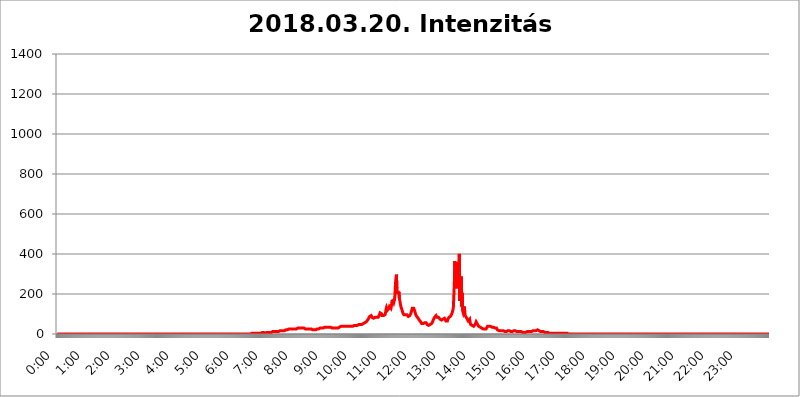
| Category | 2018.03.20. Intenzitás [W/m^2] |
|---|---|
| 0.0 | 0 |
| 0.0006944444444444445 | 0 |
| 0.001388888888888889 | 0 |
| 0.0020833333333333333 | 0 |
| 0.002777777777777778 | 0 |
| 0.003472222222222222 | 0 |
| 0.004166666666666667 | 0 |
| 0.004861111111111111 | 0 |
| 0.005555555555555556 | 0 |
| 0.0062499999999999995 | 0 |
| 0.006944444444444444 | 0 |
| 0.007638888888888889 | 0 |
| 0.008333333333333333 | 0 |
| 0.009027777777777779 | 0 |
| 0.009722222222222222 | 0 |
| 0.010416666666666666 | 0 |
| 0.011111111111111112 | 0 |
| 0.011805555555555555 | 0 |
| 0.012499999999999999 | 0 |
| 0.013194444444444444 | 0 |
| 0.013888888888888888 | 0 |
| 0.014583333333333332 | 0 |
| 0.015277777777777777 | 0 |
| 0.015972222222222224 | 0 |
| 0.016666666666666666 | 0 |
| 0.017361111111111112 | 0 |
| 0.018055555555555557 | 0 |
| 0.01875 | 0 |
| 0.019444444444444445 | 0 |
| 0.02013888888888889 | 0 |
| 0.020833333333333332 | 0 |
| 0.02152777777777778 | 0 |
| 0.022222222222222223 | 0 |
| 0.02291666666666667 | 0 |
| 0.02361111111111111 | 0 |
| 0.024305555555555556 | 0 |
| 0.024999999999999998 | 0 |
| 0.025694444444444447 | 0 |
| 0.02638888888888889 | 0 |
| 0.027083333333333334 | 0 |
| 0.027777777777777776 | 0 |
| 0.02847222222222222 | 0 |
| 0.029166666666666664 | 0 |
| 0.029861111111111113 | 0 |
| 0.030555555555555555 | 0 |
| 0.03125 | 0 |
| 0.03194444444444445 | 0 |
| 0.03263888888888889 | 0 |
| 0.03333333333333333 | 0 |
| 0.034027777777777775 | 0 |
| 0.034722222222222224 | 0 |
| 0.035416666666666666 | 0 |
| 0.036111111111111115 | 0 |
| 0.03680555555555556 | 0 |
| 0.0375 | 0 |
| 0.03819444444444444 | 0 |
| 0.03888888888888889 | 0 |
| 0.03958333333333333 | 0 |
| 0.04027777777777778 | 0 |
| 0.04097222222222222 | 0 |
| 0.041666666666666664 | 0 |
| 0.042361111111111106 | 0 |
| 0.04305555555555556 | 0 |
| 0.043750000000000004 | 0 |
| 0.044444444444444446 | 0 |
| 0.04513888888888889 | 0 |
| 0.04583333333333334 | 0 |
| 0.04652777777777778 | 0 |
| 0.04722222222222222 | 0 |
| 0.04791666666666666 | 0 |
| 0.04861111111111111 | 0 |
| 0.049305555555555554 | 0 |
| 0.049999999999999996 | 0 |
| 0.05069444444444445 | 0 |
| 0.051388888888888894 | 0 |
| 0.052083333333333336 | 0 |
| 0.05277777777777778 | 0 |
| 0.05347222222222222 | 0 |
| 0.05416666666666667 | 0 |
| 0.05486111111111111 | 0 |
| 0.05555555555555555 | 0 |
| 0.05625 | 0 |
| 0.05694444444444444 | 0 |
| 0.057638888888888885 | 0 |
| 0.05833333333333333 | 0 |
| 0.05902777777777778 | 0 |
| 0.059722222222222225 | 0 |
| 0.06041666666666667 | 0 |
| 0.061111111111111116 | 0 |
| 0.06180555555555556 | 0 |
| 0.0625 | 0 |
| 0.06319444444444444 | 0 |
| 0.06388888888888888 | 0 |
| 0.06458333333333334 | 0 |
| 0.06527777777777778 | 0 |
| 0.06597222222222222 | 0 |
| 0.06666666666666667 | 0 |
| 0.06736111111111111 | 0 |
| 0.06805555555555555 | 0 |
| 0.06874999999999999 | 0 |
| 0.06944444444444443 | 0 |
| 0.07013888888888889 | 0 |
| 0.07083333333333333 | 0 |
| 0.07152777777777779 | 0 |
| 0.07222222222222223 | 0 |
| 0.07291666666666667 | 0 |
| 0.07361111111111111 | 0 |
| 0.07430555555555556 | 0 |
| 0.075 | 0 |
| 0.07569444444444444 | 0 |
| 0.0763888888888889 | 0 |
| 0.07708333333333334 | 0 |
| 0.07777777777777778 | 0 |
| 0.07847222222222222 | 0 |
| 0.07916666666666666 | 0 |
| 0.0798611111111111 | 0 |
| 0.08055555555555556 | 0 |
| 0.08125 | 0 |
| 0.08194444444444444 | 0 |
| 0.08263888888888889 | 0 |
| 0.08333333333333333 | 0 |
| 0.08402777777777777 | 0 |
| 0.08472222222222221 | 0 |
| 0.08541666666666665 | 0 |
| 0.08611111111111112 | 0 |
| 0.08680555555555557 | 0 |
| 0.08750000000000001 | 0 |
| 0.08819444444444445 | 0 |
| 0.08888888888888889 | 0 |
| 0.08958333333333333 | 0 |
| 0.09027777777777778 | 0 |
| 0.09097222222222222 | 0 |
| 0.09166666666666667 | 0 |
| 0.09236111111111112 | 0 |
| 0.09305555555555556 | 0 |
| 0.09375 | 0 |
| 0.09444444444444444 | 0 |
| 0.09513888888888888 | 0 |
| 0.09583333333333333 | 0 |
| 0.09652777777777777 | 0 |
| 0.09722222222222222 | 0 |
| 0.09791666666666667 | 0 |
| 0.09861111111111111 | 0 |
| 0.09930555555555555 | 0 |
| 0.09999999999999999 | 0 |
| 0.10069444444444443 | 0 |
| 0.1013888888888889 | 0 |
| 0.10208333333333335 | 0 |
| 0.10277777777777779 | 0 |
| 0.10347222222222223 | 0 |
| 0.10416666666666667 | 0 |
| 0.10486111111111111 | 0 |
| 0.10555555555555556 | 0 |
| 0.10625 | 0 |
| 0.10694444444444444 | 0 |
| 0.1076388888888889 | 0 |
| 0.10833333333333334 | 0 |
| 0.10902777777777778 | 0 |
| 0.10972222222222222 | 0 |
| 0.1111111111111111 | 0 |
| 0.11180555555555556 | 0 |
| 0.11180555555555556 | 0 |
| 0.1125 | 0 |
| 0.11319444444444444 | 0 |
| 0.11388888888888889 | 0 |
| 0.11458333333333333 | 0 |
| 0.11527777777777777 | 0 |
| 0.11597222222222221 | 0 |
| 0.11666666666666665 | 0 |
| 0.1173611111111111 | 0 |
| 0.11805555555555557 | 0 |
| 0.11944444444444445 | 0 |
| 0.12013888888888889 | 0 |
| 0.12083333333333333 | 0 |
| 0.12152777777777778 | 0 |
| 0.12222222222222223 | 0 |
| 0.12291666666666667 | 0 |
| 0.12291666666666667 | 0 |
| 0.12361111111111112 | 0 |
| 0.12430555555555556 | 0 |
| 0.125 | 0 |
| 0.12569444444444444 | 0 |
| 0.12638888888888888 | 0 |
| 0.12708333333333333 | 0 |
| 0.16875 | 0 |
| 0.12847222222222224 | 0 |
| 0.12916666666666668 | 0 |
| 0.12986111111111112 | 0 |
| 0.13055555555555556 | 0 |
| 0.13125 | 0 |
| 0.13194444444444445 | 0 |
| 0.1326388888888889 | 0 |
| 0.13333333333333333 | 0 |
| 0.13402777777777777 | 0 |
| 0.13402777777777777 | 0 |
| 0.13472222222222222 | 0 |
| 0.13541666666666666 | 0 |
| 0.1361111111111111 | 0 |
| 0.13749999999999998 | 0 |
| 0.13819444444444443 | 0 |
| 0.1388888888888889 | 0 |
| 0.13958333333333334 | 0 |
| 0.14027777777777778 | 0 |
| 0.14097222222222222 | 0 |
| 0.14166666666666666 | 0 |
| 0.1423611111111111 | 0 |
| 0.14305555555555557 | 0 |
| 0.14375000000000002 | 0 |
| 0.14444444444444446 | 0 |
| 0.1451388888888889 | 0 |
| 0.1451388888888889 | 0 |
| 0.14652777777777778 | 0 |
| 0.14722222222222223 | 0 |
| 0.14791666666666667 | 0 |
| 0.1486111111111111 | 0 |
| 0.14930555555555555 | 0 |
| 0.15 | 0 |
| 0.15069444444444444 | 0 |
| 0.15138888888888888 | 0 |
| 0.15208333333333332 | 0 |
| 0.15277777777777776 | 0 |
| 0.15347222222222223 | 0 |
| 0.15416666666666667 | 0 |
| 0.15486111111111112 | 0 |
| 0.15555555555555556 | 0 |
| 0.15625 | 0 |
| 0.15694444444444444 | 0 |
| 0.15763888888888888 | 0 |
| 0.15833333333333333 | 0 |
| 0.15902777777777777 | 0 |
| 0.15972222222222224 | 0 |
| 0.16041666666666668 | 0 |
| 0.16111111111111112 | 0 |
| 0.16180555555555556 | 0 |
| 0.1625 | 0 |
| 0.16319444444444445 | 0 |
| 0.1638888888888889 | 0 |
| 0.16458333333333333 | 0 |
| 0.16527777777777777 | 0 |
| 0.16597222222222222 | 0 |
| 0.16666666666666666 | 0 |
| 0.1673611111111111 | 0 |
| 0.16805555555555554 | 0 |
| 0.16874999999999998 | 0 |
| 0.16944444444444443 | 0 |
| 0.17013888888888887 | 0 |
| 0.1708333333333333 | 0 |
| 0.17152777777777775 | 0 |
| 0.17222222222222225 | 0 |
| 0.1729166666666667 | 0 |
| 0.17361111111111113 | 0 |
| 0.17430555555555557 | 0 |
| 0.17500000000000002 | 0 |
| 0.17569444444444446 | 0 |
| 0.1763888888888889 | 0 |
| 0.17708333333333334 | 0 |
| 0.17777777777777778 | 0 |
| 0.17847222222222223 | 0 |
| 0.17916666666666667 | 0 |
| 0.1798611111111111 | 0 |
| 0.18055555555555555 | 0 |
| 0.18125 | 0 |
| 0.18194444444444444 | 0 |
| 0.1826388888888889 | 0 |
| 0.18333333333333335 | 0 |
| 0.1840277777777778 | 0 |
| 0.18472222222222223 | 0 |
| 0.18541666666666667 | 0 |
| 0.18611111111111112 | 0 |
| 0.18680555555555556 | 0 |
| 0.1875 | 0 |
| 0.18819444444444444 | 0 |
| 0.18888888888888888 | 0 |
| 0.18958333333333333 | 0 |
| 0.19027777777777777 | 0 |
| 0.1909722222222222 | 0 |
| 0.19166666666666665 | 0 |
| 0.19236111111111112 | 0 |
| 0.19305555555555554 | 0 |
| 0.19375 | 0 |
| 0.19444444444444445 | 0 |
| 0.1951388888888889 | 0 |
| 0.19583333333333333 | 0 |
| 0.19652777777777777 | 0 |
| 0.19722222222222222 | 0 |
| 0.19791666666666666 | 0 |
| 0.1986111111111111 | 0 |
| 0.19930555555555554 | 0 |
| 0.19999999999999998 | 0 |
| 0.20069444444444443 | 0 |
| 0.20138888888888887 | 0 |
| 0.2020833333333333 | 0 |
| 0.2027777777777778 | 0 |
| 0.2034722222222222 | 0 |
| 0.2041666666666667 | 0 |
| 0.20486111111111113 | 0 |
| 0.20555555555555557 | 0 |
| 0.20625000000000002 | 0 |
| 0.20694444444444446 | 0 |
| 0.2076388888888889 | 0 |
| 0.20833333333333334 | 0 |
| 0.20902777777777778 | 0 |
| 0.20972222222222223 | 0 |
| 0.21041666666666667 | 0 |
| 0.2111111111111111 | 0 |
| 0.21180555555555555 | 0 |
| 0.2125 | 0 |
| 0.21319444444444444 | 0 |
| 0.2138888888888889 | 0 |
| 0.21458333333333335 | 0 |
| 0.2152777777777778 | 0 |
| 0.21597222222222223 | 0 |
| 0.21666666666666667 | 0 |
| 0.21736111111111112 | 0 |
| 0.21805555555555556 | 0 |
| 0.21875 | 0 |
| 0.21944444444444444 | 0 |
| 0.22013888888888888 | 0 |
| 0.22083333333333333 | 0 |
| 0.22152777777777777 | 0 |
| 0.2222222222222222 | 0 |
| 0.22291666666666665 | 0 |
| 0.2236111111111111 | 0 |
| 0.22430555555555556 | 0 |
| 0.225 | 0 |
| 0.22569444444444445 | 0 |
| 0.2263888888888889 | 0 |
| 0.22708333333333333 | 0 |
| 0.22777777777777777 | 0 |
| 0.22847222222222222 | 0 |
| 0.22916666666666666 | 0 |
| 0.2298611111111111 | 0 |
| 0.23055555555555554 | 0 |
| 0.23124999999999998 | 0 |
| 0.23194444444444443 | 0 |
| 0.23263888888888887 | 0 |
| 0.2333333333333333 | 0 |
| 0.2340277777777778 | 0 |
| 0.2347222222222222 | 0 |
| 0.2354166666666667 | 0 |
| 0.23611111111111113 | 0 |
| 0.23680555555555557 | 0 |
| 0.23750000000000002 | 0 |
| 0.23819444444444446 | 0 |
| 0.2388888888888889 | 0 |
| 0.23958333333333334 | 0 |
| 0.24027777777777778 | 0 |
| 0.24097222222222223 | 0 |
| 0.24166666666666667 | 0 |
| 0.2423611111111111 | 0 |
| 0.24305555555555555 | 0 |
| 0.24375 | 0 |
| 0.24444444444444446 | 0 |
| 0.24513888888888888 | 0 |
| 0.24583333333333335 | 0 |
| 0.2465277777777778 | 0 |
| 0.24722222222222223 | 0 |
| 0.24791666666666667 | 0 |
| 0.24861111111111112 | 0 |
| 0.24930555555555556 | 0 |
| 0.25 | 0 |
| 0.25069444444444444 | 0 |
| 0.2513888888888889 | 0 |
| 0.2520833333333333 | 0 |
| 0.25277777777777777 | 0 |
| 0.2534722222222222 | 0 |
| 0.25416666666666665 | 0 |
| 0.2548611111111111 | 0 |
| 0.2555555555555556 | 0 |
| 0.25625000000000003 | 0 |
| 0.2569444444444445 | 0 |
| 0.2576388888888889 | 0 |
| 0.25833333333333336 | 0 |
| 0.2590277777777778 | 0 |
| 0.25972222222222224 | 0 |
| 0.2604166666666667 | 0 |
| 0.2611111111111111 | 0 |
| 0.26180555555555557 | 0 |
| 0.2625 | 0 |
| 0.26319444444444445 | 0 |
| 0.2638888888888889 | 0 |
| 0.26458333333333334 | 0 |
| 0.2652777777777778 | 0 |
| 0.2659722222222222 | 0 |
| 0.26666666666666666 | 0 |
| 0.2673611111111111 | 0 |
| 0.26805555555555555 | 0 |
| 0.26875 | 0 |
| 0.26944444444444443 | 3.525 |
| 0.2701388888888889 | 0 |
| 0.2708333333333333 | 0 |
| 0.27152777777777776 | 3.525 |
| 0.2722222222222222 | 3.525 |
| 0.27291666666666664 | 3.525 |
| 0.2736111111111111 | 3.525 |
| 0.2743055555555555 | 3.525 |
| 0.27499999999999997 | 3.525 |
| 0.27569444444444446 | 3.525 |
| 0.27638888888888885 | 3.525 |
| 0.27708333333333335 | 3.525 |
| 0.2777777777777778 | 3.525 |
| 0.27847222222222223 | 3.525 |
| 0.2791666666666667 | 3.525 |
| 0.2798611111111111 | 3.525 |
| 0.28055555555555556 | 3.525 |
| 0.28125 | 3.525 |
| 0.28194444444444444 | 3.525 |
| 0.2826388888888889 | 3.525 |
| 0.2833333333333333 | 3.525 |
| 0.28402777777777777 | 3.525 |
| 0.2847222222222222 | 3.525 |
| 0.28541666666666665 | 3.525 |
| 0.28611111111111115 | 7.887 |
| 0.28680555555555554 | 7.887 |
| 0.28750000000000003 | 7.887 |
| 0.2881944444444445 | 7.887 |
| 0.2888888888888889 | 7.887 |
| 0.28958333333333336 | 7.887 |
| 0.2902777777777778 | 7.887 |
| 0.29097222222222224 | 3.525 |
| 0.2916666666666667 | 3.525 |
| 0.2923611111111111 | 3.525 |
| 0.29305555555555557 | 7.887 |
| 0.29375 | 7.887 |
| 0.29444444444444445 | 7.887 |
| 0.2951388888888889 | 7.887 |
| 0.29583333333333334 | 7.887 |
| 0.2965277777777778 | 7.887 |
| 0.2972222222222222 | 7.887 |
| 0.29791666666666666 | 7.887 |
| 0.2986111111111111 | 7.887 |
| 0.29930555555555555 | 12.257 |
| 0.3 | 7.887 |
| 0.30069444444444443 | 12.257 |
| 0.3013888888888889 | 12.257 |
| 0.3020833333333333 | 12.257 |
| 0.30277777777777776 | 12.257 |
| 0.3034722222222222 | 12.257 |
| 0.30416666666666664 | 12.257 |
| 0.3048611111111111 | 12.257 |
| 0.3055555555555555 | 12.257 |
| 0.30624999999999997 | 12.257 |
| 0.3069444444444444 | 12.257 |
| 0.3076388888888889 | 12.257 |
| 0.30833333333333335 | 12.257 |
| 0.3090277777777778 | 12.257 |
| 0.30972222222222223 | 12.257 |
| 0.3104166666666667 | 12.257 |
| 0.3111111111111111 | 12.257 |
| 0.31180555555555556 | 16.636 |
| 0.3125 | 16.636 |
| 0.31319444444444444 | 16.636 |
| 0.3138888888888889 | 16.636 |
| 0.3145833333333333 | 16.636 |
| 0.31527777777777777 | 16.636 |
| 0.3159722222222222 | 16.636 |
| 0.31666666666666665 | 16.636 |
| 0.31736111111111115 | 16.636 |
| 0.31805555555555554 | 16.636 |
| 0.31875000000000003 | 16.636 |
| 0.3194444444444445 | 21.024 |
| 0.3201388888888889 | 21.024 |
| 0.32083333333333336 | 21.024 |
| 0.3215277777777778 | 21.024 |
| 0.32222222222222224 | 21.024 |
| 0.3229166666666667 | 21.024 |
| 0.3236111111111111 | 21.024 |
| 0.32430555555555557 | 21.024 |
| 0.325 | 25.419 |
| 0.32569444444444445 | 25.419 |
| 0.3263888888888889 | 25.419 |
| 0.32708333333333334 | 25.419 |
| 0.3277777777777778 | 25.419 |
| 0.3284722222222222 | 25.419 |
| 0.32916666666666666 | 25.419 |
| 0.3298611111111111 | 25.419 |
| 0.33055555555555555 | 25.419 |
| 0.33125 | 25.419 |
| 0.33194444444444443 | 25.419 |
| 0.3326388888888889 | 25.419 |
| 0.3333333333333333 | 25.419 |
| 0.3340277777777778 | 25.419 |
| 0.3347222222222222 | 25.419 |
| 0.3354166666666667 | 25.419 |
| 0.3361111111111111 | 29.823 |
| 0.3368055555555556 | 29.823 |
| 0.33749999999999997 | 29.823 |
| 0.33819444444444446 | 29.823 |
| 0.33888888888888885 | 29.823 |
| 0.33958333333333335 | 29.823 |
| 0.34027777777777773 | 29.823 |
| 0.34097222222222223 | 29.823 |
| 0.3416666666666666 | 29.823 |
| 0.3423611111111111 | 29.823 |
| 0.3430555555555555 | 29.823 |
| 0.34375 | 29.823 |
| 0.3444444444444445 | 29.823 |
| 0.3451388888888889 | 29.823 |
| 0.3458333333333334 | 29.823 |
| 0.34652777777777777 | 29.823 |
| 0.34722222222222227 | 25.419 |
| 0.34791666666666665 | 25.419 |
| 0.34861111111111115 | 25.419 |
| 0.34930555555555554 | 25.419 |
| 0.35000000000000003 | 25.419 |
| 0.3506944444444444 | 25.419 |
| 0.3513888888888889 | 25.419 |
| 0.3520833333333333 | 25.419 |
| 0.3527777777777778 | 25.419 |
| 0.3534722222222222 | 25.419 |
| 0.3541666666666667 | 25.419 |
| 0.3548611111111111 | 25.419 |
| 0.35555555555555557 | 25.419 |
| 0.35625 | 25.419 |
| 0.35694444444444445 | 25.419 |
| 0.3576388888888889 | 25.419 |
| 0.35833333333333334 | 21.024 |
| 0.3590277777777778 | 21.024 |
| 0.3597222222222222 | 21.024 |
| 0.36041666666666666 | 21.024 |
| 0.3611111111111111 | 21.024 |
| 0.36180555555555555 | 21.024 |
| 0.3625 | 21.024 |
| 0.36319444444444443 | 25.419 |
| 0.3638888888888889 | 25.419 |
| 0.3645833333333333 | 25.419 |
| 0.3652777777777778 | 25.419 |
| 0.3659722222222222 | 25.419 |
| 0.3666666666666667 | 25.419 |
| 0.3673611111111111 | 29.823 |
| 0.3680555555555556 | 25.419 |
| 0.36874999999999997 | 29.823 |
| 0.36944444444444446 | 29.823 |
| 0.37013888888888885 | 29.823 |
| 0.37083333333333335 | 29.823 |
| 0.37152777777777773 | 29.823 |
| 0.37222222222222223 | 29.823 |
| 0.3729166666666666 | 29.823 |
| 0.3736111111111111 | 34.234 |
| 0.3743055555555555 | 34.234 |
| 0.375 | 34.234 |
| 0.3756944444444445 | 34.234 |
| 0.3763888888888889 | 34.234 |
| 0.3770833333333334 | 34.234 |
| 0.37777777777777777 | 34.234 |
| 0.37847222222222227 | 34.234 |
| 0.37916666666666665 | 34.234 |
| 0.37986111111111115 | 34.234 |
| 0.38055555555555554 | 34.234 |
| 0.38125000000000003 | 34.234 |
| 0.3819444444444444 | 34.234 |
| 0.3826388888888889 | 34.234 |
| 0.3833333333333333 | 34.234 |
| 0.3840277777777778 | 29.823 |
| 0.3847222222222222 | 29.823 |
| 0.3854166666666667 | 29.823 |
| 0.3861111111111111 | 29.823 |
| 0.38680555555555557 | 29.823 |
| 0.3875 | 29.823 |
| 0.38819444444444445 | 29.823 |
| 0.3888888888888889 | 29.823 |
| 0.38958333333333334 | 29.823 |
| 0.3902777777777778 | 29.823 |
| 0.3909722222222222 | 29.823 |
| 0.39166666666666666 | 29.823 |
| 0.3923611111111111 | 29.823 |
| 0.39305555555555555 | 29.823 |
| 0.39375 | 29.823 |
| 0.39444444444444443 | 34.234 |
| 0.3951388888888889 | 34.234 |
| 0.3958333333333333 | 34.234 |
| 0.3965277777777778 | 34.234 |
| 0.3972222222222222 | 34.234 |
| 0.3979166666666667 | 38.653 |
| 0.3986111111111111 | 38.653 |
| 0.3993055555555556 | 38.653 |
| 0.39999999999999997 | 38.653 |
| 0.40069444444444446 | 38.653 |
| 0.40138888888888885 | 38.653 |
| 0.40208333333333335 | 38.653 |
| 0.40277777777777773 | 38.653 |
| 0.40347222222222223 | 38.653 |
| 0.4041666666666666 | 38.653 |
| 0.4048611111111111 | 38.653 |
| 0.4055555555555555 | 38.653 |
| 0.40625 | 38.653 |
| 0.4069444444444445 | 38.653 |
| 0.4076388888888889 | 38.653 |
| 0.4083333333333334 | 38.653 |
| 0.40902777777777777 | 38.653 |
| 0.40972222222222227 | 38.653 |
| 0.41041666666666665 | 38.653 |
| 0.41111111111111115 | 38.653 |
| 0.41180555555555554 | 38.653 |
| 0.41250000000000003 | 38.653 |
| 0.4131944444444444 | 38.653 |
| 0.4138888888888889 | 38.653 |
| 0.4145833333333333 | 38.653 |
| 0.4152777777777778 | 38.653 |
| 0.4159722222222222 | 38.653 |
| 0.4166666666666667 | 43.079 |
| 0.4173611111111111 | 38.653 |
| 0.41805555555555557 | 43.079 |
| 0.41875 | 43.079 |
| 0.41944444444444445 | 43.079 |
| 0.4201388888888889 | 43.079 |
| 0.42083333333333334 | 43.079 |
| 0.4215277777777778 | 43.079 |
| 0.4222222222222222 | 43.079 |
| 0.42291666666666666 | 47.511 |
| 0.4236111111111111 | 47.511 |
| 0.42430555555555555 | 47.511 |
| 0.425 | 47.511 |
| 0.42569444444444443 | 47.511 |
| 0.4263888888888889 | 47.511 |
| 0.4270833333333333 | 47.511 |
| 0.4277777777777778 | 51.951 |
| 0.4284722222222222 | 51.951 |
| 0.4291666666666667 | 51.951 |
| 0.4298611111111111 | 56.398 |
| 0.4305555555555556 | 56.398 |
| 0.43124999999999997 | 56.398 |
| 0.43194444444444446 | 60.85 |
| 0.43263888888888885 | 60.85 |
| 0.43333333333333335 | 60.85 |
| 0.43402777777777773 | 65.31 |
| 0.43472222222222223 | 65.31 |
| 0.4354166666666666 | 69.775 |
| 0.4361111111111111 | 74.246 |
| 0.4368055555555555 | 78.722 |
| 0.4375 | 83.205 |
| 0.4381944444444445 | 87.692 |
| 0.4388888888888889 | 87.692 |
| 0.4395833333333334 | 92.184 |
| 0.44027777777777777 | 92.184 |
| 0.44097222222222227 | 92.184 |
| 0.44166666666666665 | 83.205 |
| 0.44236111111111115 | 83.205 |
| 0.44305555555555554 | 78.722 |
| 0.44375000000000003 | 78.722 |
| 0.4444444444444444 | 78.722 |
| 0.4451388888888889 | 83.205 |
| 0.4458333333333333 | 83.205 |
| 0.4465277777777778 | 87.692 |
| 0.4472222222222222 | 83.205 |
| 0.4479166666666667 | 83.205 |
| 0.4486111111111111 | 83.205 |
| 0.44930555555555557 | 83.205 |
| 0.45 | 83.205 |
| 0.45069444444444445 | 87.692 |
| 0.4513888888888889 | 92.184 |
| 0.45208333333333334 | 96.682 |
| 0.4527777777777778 | 105.69 |
| 0.4534722222222222 | 110.201 |
| 0.45416666666666666 | 110.201 |
| 0.4548611111111111 | 101.184 |
| 0.45555555555555555 | 92.184 |
| 0.45625 | 92.184 |
| 0.45694444444444443 | 96.682 |
| 0.4576388888888889 | 92.184 |
| 0.4583333333333333 | 87.692 |
| 0.4590277777777778 | 92.184 |
| 0.4597222222222222 | 96.682 |
| 0.4604166666666667 | 105.69 |
| 0.4611111111111111 | 123.758 |
| 0.4618055555555556 | 132.814 |
| 0.46249999999999997 | 132.814 |
| 0.46319444444444446 | 119.235 |
| 0.46388888888888885 | 114.716 |
| 0.46458333333333335 | 119.235 |
| 0.46527777777777773 | 128.284 |
| 0.46597222222222223 | 137.347 |
| 0.4666666666666666 | 132.814 |
| 0.4673611111111111 | 132.814 |
| 0.4680555555555555 | 128.284 |
| 0.46875 | 141.884 |
| 0.4694444444444445 | 164.605 |
| 0.4701388888888889 | 160.056 |
| 0.4708333333333334 | 160.056 |
| 0.47152777777777777 | 169.156 |
| 0.47222222222222227 | 160.056 |
| 0.47291666666666665 | 169.156 |
| 0.47361111111111115 | 191.937 |
| 0.47430555555555554 | 246.689 |
| 0.47500000000000003 | 278.603 |
| 0.4756944444444444 | 296.808 |
| 0.4763888888888889 | 228.436 |
| 0.4770833333333333 | 201.058 |
| 0.4777777777777778 | 214.746 |
| 0.4784722222222222 | 201.058 |
| 0.4791666666666667 | 210.182 |
| 0.4798611111111111 | 178.264 |
| 0.48055555555555557 | 164.605 |
| 0.48125 | 164.605 |
| 0.48194444444444445 | 137.347 |
| 0.4826388888888889 | 132.814 |
| 0.48333333333333334 | 137.347 |
| 0.4840277777777778 | 114.716 |
| 0.4847222222222222 | 105.69 |
| 0.48541666666666666 | 101.184 |
| 0.4861111111111111 | 96.682 |
| 0.48680555555555555 | 96.682 |
| 0.4875 | 92.184 |
| 0.48819444444444443 | 96.682 |
| 0.4888888888888889 | 101.184 |
| 0.4895833333333333 | 101.184 |
| 0.4902777777777778 | 96.682 |
| 0.4909722222222222 | 92.184 |
| 0.4916666666666667 | 92.184 |
| 0.4923611111111111 | 87.692 |
| 0.4930555555555556 | 87.692 |
| 0.49374999999999997 | 87.692 |
| 0.49444444444444446 | 92.184 |
| 0.49513888888888885 | 96.682 |
| 0.49583333333333335 | 101.184 |
| 0.49652777777777773 | 110.201 |
| 0.49722222222222223 | 119.235 |
| 0.4979166666666666 | 128.284 |
| 0.4986111111111111 | 132.814 |
| 0.4993055555555555 | 132.814 |
| 0.5 | 128.284 |
| 0.5006944444444444 | 123.758 |
| 0.5013888888888889 | 114.716 |
| 0.5020833333333333 | 105.69 |
| 0.5027777777777778 | 96.682 |
| 0.5034722222222222 | 92.184 |
| 0.5041666666666667 | 87.692 |
| 0.5048611111111111 | 83.205 |
| 0.5055555555555555 | 83.205 |
| 0.50625 | 78.722 |
| 0.5069444444444444 | 74.246 |
| 0.5076388888888889 | 69.775 |
| 0.5083333333333333 | 69.775 |
| 0.5090277777777777 | 65.31 |
| 0.5097222222222222 | 60.85 |
| 0.5104166666666666 | 56.398 |
| 0.5111111111111112 | 51.951 |
| 0.5118055555555555 | 51.951 |
| 0.5125000000000001 | 51.951 |
| 0.5131944444444444 | 51.951 |
| 0.513888888888889 | 51.951 |
| 0.5145833333333333 | 51.951 |
| 0.5152777777777778 | 56.398 |
| 0.5159722222222222 | 56.398 |
| 0.5166666666666667 | 56.398 |
| 0.517361111111111 | 56.398 |
| 0.5180555555555556 | 51.951 |
| 0.5187499999999999 | 47.511 |
| 0.5194444444444445 | 47.511 |
| 0.5201388888888888 | 43.079 |
| 0.5208333333333334 | 43.079 |
| 0.5215277777777778 | 47.511 |
| 0.5222222222222223 | 47.511 |
| 0.5229166666666667 | 47.511 |
| 0.5236111111111111 | 47.511 |
| 0.5243055555555556 | 47.511 |
| 0.525 | 51.951 |
| 0.5256944444444445 | 56.398 |
| 0.5263888888888889 | 60.85 |
| 0.5270833333333333 | 65.31 |
| 0.5277777777777778 | 74.246 |
| 0.5284722222222222 | 78.722 |
| 0.5291666666666667 | 83.205 |
| 0.5298611111111111 | 83.205 |
| 0.5305555555555556 | 87.692 |
| 0.53125 | 92.184 |
| 0.5319444444444444 | 87.692 |
| 0.5326388888888889 | 83.205 |
| 0.5333333333333333 | 83.205 |
| 0.5340277777777778 | 83.205 |
| 0.5347222222222222 | 83.205 |
| 0.5354166666666667 | 78.722 |
| 0.5361111111111111 | 78.722 |
| 0.5368055555555555 | 74.246 |
| 0.5375 | 74.246 |
| 0.5381944444444444 | 69.775 |
| 0.5388888888888889 | 69.775 |
| 0.5395833333333333 | 69.775 |
| 0.5402777777777777 | 74.246 |
| 0.5409722222222222 | 74.246 |
| 0.5416666666666666 | 74.246 |
| 0.5423611111111112 | 78.722 |
| 0.5430555555555555 | 78.722 |
| 0.5437500000000001 | 74.246 |
| 0.5444444444444444 | 74.246 |
| 0.545138888888889 | 65.31 |
| 0.5458333333333333 | 60.85 |
| 0.5465277777777778 | 60.85 |
| 0.5472222222222222 | 65.31 |
| 0.5479166666666667 | 74.246 |
| 0.548611111111111 | 74.246 |
| 0.5493055555555556 | 83.205 |
| 0.5499999999999999 | 83.205 |
| 0.5506944444444445 | 87.692 |
| 0.5513888888888888 | 87.692 |
| 0.5520833333333334 | 92.184 |
| 0.5527777777777778 | 92.184 |
| 0.5534722222222223 | 101.184 |
| 0.5541666666666667 | 105.69 |
| 0.5548611111111111 | 119.235 |
| 0.5555555555555556 | 132.814 |
| 0.55625 | 191.937 |
| 0.5569444444444445 | 255.813 |
| 0.5576388888888889 | 364.728 |
| 0.5583333333333333 | 242.127 |
| 0.5590277777777778 | 228.436 |
| 0.5597222222222222 | 360.221 |
| 0.5604166666666667 | 246.689 |
| 0.5611111111111111 | 319.517 |
| 0.5618055555555556 | 228.436 |
| 0.5625 | 228.436 |
| 0.5631944444444444 | 314.98 |
| 0.5638888888888889 | 400.638 |
| 0.5645833333333333 | 164.605 |
| 0.5652777777777778 | 237.564 |
| 0.5659722222222222 | 242.127 |
| 0.5666666666666667 | 287.709 |
| 0.5673611111111111 | 137.347 |
| 0.5680555555555555 | 205.62 |
| 0.56875 | 114.716 |
| 0.5694444444444444 | 105.69 |
| 0.5701388888888889 | 114.716 |
| 0.5708333333333333 | 137.347 |
| 0.5715277777777777 | 110.201 |
| 0.5722222222222222 | 92.184 |
| 0.5729166666666666 | 87.692 |
| 0.5736111111111112 | 83.205 |
| 0.5743055555555555 | 78.722 |
| 0.5750000000000001 | 74.246 |
| 0.5756944444444444 | 69.775 |
| 0.576388888888889 | 65.31 |
| 0.5770833333333333 | 60.85 |
| 0.5777777777777778 | 60.85 |
| 0.5784722222222222 | 74.246 |
| 0.5791666666666667 | 56.398 |
| 0.579861111111111 | 47.511 |
| 0.5805555555555556 | 43.079 |
| 0.5812499999999999 | 43.079 |
| 0.5819444444444445 | 43.079 |
| 0.5826388888888888 | 47.511 |
| 0.5833333333333334 | 43.079 |
| 0.5840277777777778 | 38.653 |
| 0.5847222222222223 | 43.079 |
| 0.5854166666666667 | 43.079 |
| 0.5861111111111111 | 47.511 |
| 0.5868055555555556 | 51.951 |
| 0.5875 | 60.85 |
| 0.5881944444444445 | 65.31 |
| 0.5888888888888889 | 60.85 |
| 0.5895833333333333 | 47.511 |
| 0.5902777777777778 | 43.079 |
| 0.5909722222222222 | 38.653 |
| 0.5916666666666667 | 34.234 |
| 0.5923611111111111 | 34.234 |
| 0.5930555555555556 | 34.234 |
| 0.59375 | 29.823 |
| 0.5944444444444444 | 29.823 |
| 0.5951388888888889 | 29.823 |
| 0.5958333333333333 | 29.823 |
| 0.5965277777777778 | 25.419 |
| 0.5972222222222222 | 25.419 |
| 0.5979166666666667 | 29.823 |
| 0.5986111111111111 | 25.419 |
| 0.5993055555555555 | 25.419 |
| 0.6 | 25.419 |
| 0.6006944444444444 | 25.419 |
| 0.6013888888888889 | 25.419 |
| 0.6020833333333333 | 25.419 |
| 0.6027777777777777 | 29.823 |
| 0.6034722222222222 | 38.653 |
| 0.6041666666666666 | 38.653 |
| 0.6048611111111112 | 38.653 |
| 0.6055555555555555 | 38.653 |
| 0.6062500000000001 | 38.653 |
| 0.6069444444444444 | 38.653 |
| 0.607638888888889 | 38.653 |
| 0.6083333333333333 | 38.653 |
| 0.6090277777777778 | 38.653 |
| 0.6097222222222222 | 34.234 |
| 0.6104166666666667 | 29.823 |
| 0.611111111111111 | 29.823 |
| 0.6118055555555556 | 34.234 |
| 0.6124999999999999 | 29.823 |
| 0.6131944444444445 | 29.823 |
| 0.6138888888888888 | 29.823 |
| 0.6145833333333334 | 29.823 |
| 0.6152777777777778 | 29.823 |
| 0.6159722222222223 | 29.823 |
| 0.6166666666666667 | 25.419 |
| 0.6173611111111111 | 21.024 |
| 0.6180555555555556 | 21.024 |
| 0.61875 | 21.024 |
| 0.6194444444444445 | 16.636 |
| 0.6201388888888889 | 16.636 |
| 0.6208333333333333 | 16.636 |
| 0.6215277777777778 | 16.636 |
| 0.6222222222222222 | 16.636 |
| 0.6229166666666667 | 21.024 |
| 0.6236111111111111 | 16.636 |
| 0.6243055555555556 | 16.636 |
| 0.625 | 16.636 |
| 0.6256944444444444 | 16.636 |
| 0.6263888888888889 | 16.636 |
| 0.6270833333333333 | 16.636 |
| 0.6277777777777778 | 12.257 |
| 0.6284722222222222 | 16.636 |
| 0.6291666666666667 | 12.257 |
| 0.6298611111111111 | 12.257 |
| 0.6305555555555555 | 16.636 |
| 0.63125 | 16.636 |
| 0.6319444444444444 | 16.636 |
| 0.6326388888888889 | 16.636 |
| 0.6333333333333333 | 16.636 |
| 0.6340277777777777 | 16.636 |
| 0.6347222222222222 | 12.257 |
| 0.6354166666666666 | 12.257 |
| 0.6361111111111112 | 12.257 |
| 0.6368055555555555 | 12.257 |
| 0.6375000000000001 | 12.257 |
| 0.6381944444444444 | 12.257 |
| 0.638888888888889 | 12.257 |
| 0.6395833333333333 | 12.257 |
| 0.6402777777777778 | 16.636 |
| 0.6409722222222222 | 16.636 |
| 0.6416666666666667 | 16.636 |
| 0.642361111111111 | 16.636 |
| 0.6430555555555556 | 12.257 |
| 0.6437499999999999 | 12.257 |
| 0.6444444444444445 | 12.257 |
| 0.6451388888888888 | 12.257 |
| 0.6458333333333334 | 12.257 |
| 0.6465277777777778 | 12.257 |
| 0.6472222222222223 | 12.257 |
| 0.6479166666666667 | 12.257 |
| 0.6486111111111111 | 12.257 |
| 0.6493055555555556 | 12.257 |
| 0.65 | 12.257 |
| 0.6506944444444445 | 12.257 |
| 0.6513888888888889 | 12.257 |
| 0.6520833333333333 | 7.887 |
| 0.6527777777777778 | 7.887 |
| 0.6534722222222222 | 7.887 |
| 0.6541666666666667 | 7.887 |
| 0.6548611111111111 | 7.887 |
| 0.6555555555555556 | 7.887 |
| 0.65625 | 12.257 |
| 0.6569444444444444 | 7.887 |
| 0.6576388888888889 | 7.887 |
| 0.6583333333333333 | 12.257 |
| 0.6590277777777778 | 12.257 |
| 0.6597222222222222 | 12.257 |
| 0.6604166666666667 | 12.257 |
| 0.6611111111111111 | 12.257 |
| 0.6618055555555555 | 12.257 |
| 0.6625 | 12.257 |
| 0.6631944444444444 | 12.257 |
| 0.6638888888888889 | 12.257 |
| 0.6645833333333333 | 12.257 |
| 0.6652777777777777 | 12.257 |
| 0.6659722222222222 | 16.636 |
| 0.6666666666666666 | 16.636 |
| 0.6673611111111111 | 16.636 |
| 0.6680555555555556 | 16.636 |
| 0.6687500000000001 | 16.636 |
| 0.6694444444444444 | 16.636 |
| 0.6701388888888888 | 16.636 |
| 0.6708333333333334 | 16.636 |
| 0.6715277777777778 | 16.636 |
| 0.6722222222222222 | 21.024 |
| 0.6729166666666666 | 21.024 |
| 0.6736111111111112 | 21.024 |
| 0.6743055555555556 | 21.024 |
| 0.6749999999999999 | 16.636 |
| 0.6756944444444444 | 16.636 |
| 0.6763888888888889 | 16.636 |
| 0.6770833333333334 | 16.636 |
| 0.6777777777777777 | 12.257 |
| 0.6784722222222223 | 12.257 |
| 0.6791666666666667 | 12.257 |
| 0.6798611111111111 | 12.257 |
| 0.6805555555555555 | 12.257 |
| 0.68125 | 12.257 |
| 0.6819444444444445 | 12.257 |
| 0.6826388888888889 | 12.257 |
| 0.6833333333333332 | 12.257 |
| 0.6840277777777778 | 7.887 |
| 0.6847222222222222 | 7.887 |
| 0.6854166666666667 | 7.887 |
| 0.686111111111111 | 7.887 |
| 0.6868055555555556 | 7.887 |
| 0.6875 | 7.887 |
| 0.6881944444444444 | 7.887 |
| 0.688888888888889 | 7.887 |
| 0.6895833333333333 | 3.525 |
| 0.6902777777777778 | 3.525 |
| 0.6909722222222222 | 3.525 |
| 0.6916666666666668 | 3.525 |
| 0.6923611111111111 | 3.525 |
| 0.6930555555555555 | 3.525 |
| 0.69375 | 3.525 |
| 0.6944444444444445 | 3.525 |
| 0.6951388888888889 | 3.525 |
| 0.6958333333333333 | 3.525 |
| 0.6965277777777777 | 3.525 |
| 0.6972222222222223 | 3.525 |
| 0.6979166666666666 | 3.525 |
| 0.6986111111111111 | 3.525 |
| 0.6993055555555556 | 3.525 |
| 0.7000000000000001 | 3.525 |
| 0.7006944444444444 | 3.525 |
| 0.7013888888888888 | 3.525 |
| 0.7020833333333334 | 3.525 |
| 0.7027777777777778 | 3.525 |
| 0.7034722222222222 | 3.525 |
| 0.7041666666666666 | 3.525 |
| 0.7048611111111112 | 3.525 |
| 0.7055555555555556 | 3.525 |
| 0.7062499999999999 | 3.525 |
| 0.7069444444444444 | 3.525 |
| 0.7076388888888889 | 3.525 |
| 0.7083333333333334 | 3.525 |
| 0.7090277777777777 | 3.525 |
| 0.7097222222222223 | 3.525 |
| 0.7104166666666667 | 3.525 |
| 0.7111111111111111 | 3.525 |
| 0.7118055555555555 | 3.525 |
| 0.7125 | 3.525 |
| 0.7131944444444445 | 3.525 |
| 0.7138888888888889 | 3.525 |
| 0.7145833333333332 | 3.525 |
| 0.7152777777777778 | 3.525 |
| 0.7159722222222222 | 3.525 |
| 0.7166666666666667 | 0 |
| 0.717361111111111 | 0 |
| 0.7180555555555556 | 0 |
| 0.71875 | 0 |
| 0.7194444444444444 | 0 |
| 0.720138888888889 | 0 |
| 0.7208333333333333 | 0 |
| 0.7215277777777778 | 0 |
| 0.7222222222222222 | 0 |
| 0.7229166666666668 | 0 |
| 0.7236111111111111 | 0 |
| 0.7243055555555555 | 0 |
| 0.725 | 0 |
| 0.7256944444444445 | 0 |
| 0.7263888888888889 | 0 |
| 0.7270833333333333 | 0 |
| 0.7277777777777777 | 0 |
| 0.7284722222222223 | 0 |
| 0.7291666666666666 | 0 |
| 0.7298611111111111 | 0 |
| 0.7305555555555556 | 0 |
| 0.7312500000000001 | 0 |
| 0.7319444444444444 | 0 |
| 0.7326388888888888 | 0 |
| 0.7333333333333334 | 0 |
| 0.7340277777777778 | 0 |
| 0.7347222222222222 | 0 |
| 0.7354166666666666 | 0 |
| 0.7361111111111112 | 0 |
| 0.7368055555555556 | 0 |
| 0.7374999999999999 | 0 |
| 0.7381944444444444 | 0 |
| 0.7388888888888889 | 0 |
| 0.7395833333333334 | 0 |
| 0.7402777777777777 | 0 |
| 0.7409722222222223 | 0 |
| 0.7416666666666667 | 0 |
| 0.7423611111111111 | 0 |
| 0.7430555555555555 | 0 |
| 0.74375 | 0 |
| 0.7444444444444445 | 0 |
| 0.7451388888888889 | 0 |
| 0.7458333333333332 | 0 |
| 0.7465277777777778 | 0 |
| 0.7472222222222222 | 0 |
| 0.7479166666666667 | 0 |
| 0.748611111111111 | 0 |
| 0.7493055555555556 | 0 |
| 0.75 | 0 |
| 0.7506944444444444 | 0 |
| 0.751388888888889 | 0 |
| 0.7520833333333333 | 0 |
| 0.7527777777777778 | 0 |
| 0.7534722222222222 | 0 |
| 0.7541666666666668 | 0 |
| 0.7548611111111111 | 0 |
| 0.7555555555555555 | 0 |
| 0.75625 | 0 |
| 0.7569444444444445 | 0 |
| 0.7576388888888889 | 0 |
| 0.7583333333333333 | 0 |
| 0.7590277777777777 | 0 |
| 0.7597222222222223 | 0 |
| 0.7604166666666666 | 0 |
| 0.7611111111111111 | 0 |
| 0.7618055555555556 | 0 |
| 0.7625000000000001 | 0 |
| 0.7631944444444444 | 0 |
| 0.7638888888888888 | 0 |
| 0.7645833333333334 | 0 |
| 0.7652777777777778 | 0 |
| 0.7659722222222222 | 0 |
| 0.7666666666666666 | 0 |
| 0.7673611111111112 | 0 |
| 0.7680555555555556 | 0 |
| 0.7687499999999999 | 0 |
| 0.7694444444444444 | 0 |
| 0.7701388888888889 | 0 |
| 0.7708333333333334 | 0 |
| 0.7715277777777777 | 0 |
| 0.7722222222222223 | 0 |
| 0.7729166666666667 | 0 |
| 0.7736111111111111 | 0 |
| 0.7743055555555555 | 0 |
| 0.775 | 0 |
| 0.7756944444444445 | 0 |
| 0.7763888888888889 | 0 |
| 0.7770833333333332 | 0 |
| 0.7777777777777778 | 0 |
| 0.7784722222222222 | 0 |
| 0.7791666666666667 | 0 |
| 0.779861111111111 | 0 |
| 0.7805555555555556 | 0 |
| 0.78125 | 0 |
| 0.7819444444444444 | 0 |
| 0.782638888888889 | 0 |
| 0.7833333333333333 | 0 |
| 0.7840277777777778 | 0 |
| 0.7847222222222222 | 0 |
| 0.7854166666666668 | 0 |
| 0.7861111111111111 | 0 |
| 0.7868055555555555 | 0 |
| 0.7875 | 0 |
| 0.7881944444444445 | 0 |
| 0.7888888888888889 | 0 |
| 0.7895833333333333 | 0 |
| 0.7902777777777777 | 0 |
| 0.7909722222222223 | 0 |
| 0.7916666666666666 | 0 |
| 0.7923611111111111 | 0 |
| 0.7930555555555556 | 0 |
| 0.7937500000000001 | 0 |
| 0.7944444444444444 | 0 |
| 0.7951388888888888 | 0 |
| 0.7958333333333334 | 0 |
| 0.7965277777777778 | 0 |
| 0.7972222222222222 | 0 |
| 0.7979166666666666 | 0 |
| 0.7986111111111112 | 0 |
| 0.7993055555555556 | 0 |
| 0.7999999999999999 | 0 |
| 0.8006944444444444 | 0 |
| 0.8013888888888889 | 0 |
| 0.8020833333333334 | 0 |
| 0.8027777777777777 | 0 |
| 0.8034722222222223 | 0 |
| 0.8041666666666667 | 0 |
| 0.8048611111111111 | 0 |
| 0.8055555555555555 | 0 |
| 0.80625 | 0 |
| 0.8069444444444445 | 0 |
| 0.8076388888888889 | 0 |
| 0.8083333333333332 | 0 |
| 0.8090277777777778 | 0 |
| 0.8097222222222222 | 0 |
| 0.8104166666666667 | 0 |
| 0.811111111111111 | 0 |
| 0.8118055555555556 | 0 |
| 0.8125 | 0 |
| 0.8131944444444444 | 0 |
| 0.813888888888889 | 0 |
| 0.8145833333333333 | 0 |
| 0.8152777777777778 | 0 |
| 0.8159722222222222 | 0 |
| 0.8166666666666668 | 0 |
| 0.8173611111111111 | 0 |
| 0.8180555555555555 | 0 |
| 0.81875 | 0 |
| 0.8194444444444445 | 0 |
| 0.8201388888888889 | 0 |
| 0.8208333333333333 | 0 |
| 0.8215277777777777 | 0 |
| 0.8222222222222223 | 0 |
| 0.8229166666666666 | 0 |
| 0.8236111111111111 | 0 |
| 0.8243055555555556 | 0 |
| 0.8250000000000001 | 0 |
| 0.8256944444444444 | 0 |
| 0.8263888888888888 | 0 |
| 0.8270833333333334 | 0 |
| 0.8277777777777778 | 0 |
| 0.8284722222222222 | 0 |
| 0.8291666666666666 | 0 |
| 0.8298611111111112 | 0 |
| 0.8305555555555556 | 0 |
| 0.8312499999999999 | 0 |
| 0.8319444444444444 | 0 |
| 0.8326388888888889 | 0 |
| 0.8333333333333334 | 0 |
| 0.8340277777777777 | 0 |
| 0.8347222222222223 | 0 |
| 0.8354166666666667 | 0 |
| 0.8361111111111111 | 0 |
| 0.8368055555555555 | 0 |
| 0.8375 | 0 |
| 0.8381944444444445 | 0 |
| 0.8388888888888889 | 0 |
| 0.8395833333333332 | 0 |
| 0.8402777777777778 | 0 |
| 0.8409722222222222 | 0 |
| 0.8416666666666667 | 0 |
| 0.842361111111111 | 0 |
| 0.8430555555555556 | 0 |
| 0.84375 | 0 |
| 0.8444444444444444 | 0 |
| 0.845138888888889 | 0 |
| 0.8458333333333333 | 0 |
| 0.8465277777777778 | 0 |
| 0.8472222222222222 | 0 |
| 0.8479166666666668 | 0 |
| 0.8486111111111111 | 0 |
| 0.8493055555555555 | 0 |
| 0.85 | 0 |
| 0.8506944444444445 | 0 |
| 0.8513888888888889 | 0 |
| 0.8520833333333333 | 0 |
| 0.8527777777777777 | 0 |
| 0.8534722222222223 | 0 |
| 0.8541666666666666 | 0 |
| 0.8548611111111111 | 0 |
| 0.8555555555555556 | 0 |
| 0.8562500000000001 | 0 |
| 0.8569444444444444 | 0 |
| 0.8576388888888888 | 0 |
| 0.8583333333333334 | 0 |
| 0.8590277777777778 | 0 |
| 0.8597222222222222 | 0 |
| 0.8604166666666666 | 0 |
| 0.8611111111111112 | 0 |
| 0.8618055555555556 | 0 |
| 0.8624999999999999 | 0 |
| 0.8631944444444444 | 0 |
| 0.8638888888888889 | 0 |
| 0.8645833333333334 | 0 |
| 0.8652777777777777 | 0 |
| 0.8659722222222223 | 0 |
| 0.8666666666666667 | 0 |
| 0.8673611111111111 | 0 |
| 0.8680555555555555 | 0 |
| 0.86875 | 0 |
| 0.8694444444444445 | 0 |
| 0.8701388888888889 | 0 |
| 0.8708333333333332 | 0 |
| 0.8715277777777778 | 0 |
| 0.8722222222222222 | 0 |
| 0.8729166666666667 | 0 |
| 0.873611111111111 | 0 |
| 0.8743055555555556 | 0 |
| 0.875 | 0 |
| 0.8756944444444444 | 0 |
| 0.876388888888889 | 0 |
| 0.8770833333333333 | 0 |
| 0.8777777777777778 | 0 |
| 0.8784722222222222 | 0 |
| 0.8791666666666668 | 0 |
| 0.8798611111111111 | 0 |
| 0.8805555555555555 | 0 |
| 0.88125 | 0 |
| 0.8819444444444445 | 0 |
| 0.8826388888888889 | 0 |
| 0.8833333333333333 | 0 |
| 0.8840277777777777 | 0 |
| 0.8847222222222223 | 0 |
| 0.8854166666666666 | 0 |
| 0.8861111111111111 | 0 |
| 0.8868055555555556 | 0 |
| 0.8875000000000001 | 0 |
| 0.8881944444444444 | 0 |
| 0.8888888888888888 | 0 |
| 0.8895833333333334 | 0 |
| 0.8902777777777778 | 0 |
| 0.8909722222222222 | 0 |
| 0.8916666666666666 | 0 |
| 0.8923611111111112 | 0 |
| 0.8930555555555556 | 0 |
| 0.8937499999999999 | 0 |
| 0.8944444444444444 | 0 |
| 0.8951388888888889 | 0 |
| 0.8958333333333334 | 0 |
| 0.8965277777777777 | 0 |
| 0.8972222222222223 | 0 |
| 0.8979166666666667 | 0 |
| 0.8986111111111111 | 0 |
| 0.8993055555555555 | 0 |
| 0.9 | 0 |
| 0.9006944444444445 | 0 |
| 0.9013888888888889 | 0 |
| 0.9020833333333332 | 0 |
| 0.9027777777777778 | 0 |
| 0.9034722222222222 | 0 |
| 0.9041666666666667 | 0 |
| 0.904861111111111 | 0 |
| 0.9055555555555556 | 0 |
| 0.90625 | 0 |
| 0.9069444444444444 | 0 |
| 0.907638888888889 | 0 |
| 0.9083333333333333 | 0 |
| 0.9090277777777778 | 0 |
| 0.9097222222222222 | 0 |
| 0.9104166666666668 | 0 |
| 0.9111111111111111 | 0 |
| 0.9118055555555555 | 0 |
| 0.9125 | 0 |
| 0.9131944444444445 | 0 |
| 0.9138888888888889 | 0 |
| 0.9145833333333333 | 0 |
| 0.9152777777777777 | 0 |
| 0.9159722222222223 | 0 |
| 0.9166666666666666 | 0 |
| 0.9173611111111111 | 0 |
| 0.9180555555555556 | 0 |
| 0.9187500000000001 | 0 |
| 0.9194444444444444 | 0 |
| 0.9201388888888888 | 0 |
| 0.9208333333333334 | 0 |
| 0.9215277777777778 | 0 |
| 0.9222222222222222 | 0 |
| 0.9229166666666666 | 0 |
| 0.9236111111111112 | 0 |
| 0.9243055555555556 | 0 |
| 0.9249999999999999 | 0 |
| 0.9256944444444444 | 0 |
| 0.9263888888888889 | 0 |
| 0.9270833333333334 | 0 |
| 0.9277777777777777 | 0 |
| 0.9284722222222223 | 0 |
| 0.9291666666666667 | 0 |
| 0.9298611111111111 | 0 |
| 0.9305555555555555 | 0 |
| 0.93125 | 0 |
| 0.9319444444444445 | 0 |
| 0.9326388888888889 | 0 |
| 0.9333333333333332 | 0 |
| 0.9340277777777778 | 0 |
| 0.9347222222222222 | 0 |
| 0.9354166666666667 | 0 |
| 0.936111111111111 | 0 |
| 0.9368055555555556 | 0 |
| 0.9375 | 0 |
| 0.9381944444444444 | 0 |
| 0.938888888888889 | 0 |
| 0.9395833333333333 | 0 |
| 0.9402777777777778 | 0 |
| 0.9409722222222222 | 0 |
| 0.9416666666666668 | 0 |
| 0.9423611111111111 | 0 |
| 0.9430555555555555 | 0 |
| 0.94375 | 0 |
| 0.9444444444444445 | 0 |
| 0.9451388888888889 | 0 |
| 0.9458333333333333 | 0 |
| 0.9465277777777777 | 0 |
| 0.9472222222222223 | 0 |
| 0.9479166666666666 | 0 |
| 0.9486111111111111 | 0 |
| 0.9493055555555556 | 0 |
| 0.9500000000000001 | 0 |
| 0.9506944444444444 | 0 |
| 0.9513888888888888 | 0 |
| 0.9520833333333334 | 0 |
| 0.9527777777777778 | 0 |
| 0.9534722222222222 | 0 |
| 0.9541666666666666 | 0 |
| 0.9548611111111112 | 0 |
| 0.9555555555555556 | 0 |
| 0.9562499999999999 | 0 |
| 0.9569444444444444 | 0 |
| 0.9576388888888889 | 0 |
| 0.9583333333333334 | 0 |
| 0.9590277777777777 | 0 |
| 0.9597222222222223 | 0 |
| 0.9604166666666667 | 0 |
| 0.9611111111111111 | 0 |
| 0.9618055555555555 | 0 |
| 0.9625 | 0 |
| 0.9631944444444445 | 0 |
| 0.9638888888888889 | 0 |
| 0.9645833333333332 | 0 |
| 0.9652777777777778 | 0 |
| 0.9659722222222222 | 0 |
| 0.9666666666666667 | 0 |
| 0.967361111111111 | 0 |
| 0.9680555555555556 | 0 |
| 0.96875 | 0 |
| 0.9694444444444444 | 0 |
| 0.970138888888889 | 0 |
| 0.9708333333333333 | 0 |
| 0.9715277777777778 | 0 |
| 0.9722222222222222 | 0 |
| 0.9729166666666668 | 0 |
| 0.9736111111111111 | 0 |
| 0.9743055555555555 | 0 |
| 0.975 | 0 |
| 0.9756944444444445 | 0 |
| 0.9763888888888889 | 0 |
| 0.9770833333333333 | 0 |
| 0.9777777777777777 | 0 |
| 0.9784722222222223 | 0 |
| 0.9791666666666666 | 0 |
| 0.9798611111111111 | 0 |
| 0.9805555555555556 | 0 |
| 0.9812500000000001 | 0 |
| 0.9819444444444444 | 0 |
| 0.9826388888888888 | 0 |
| 0.9833333333333334 | 0 |
| 0.9840277777777778 | 0 |
| 0.9847222222222222 | 0 |
| 0.9854166666666666 | 0 |
| 0.9861111111111112 | 0 |
| 0.9868055555555556 | 0 |
| 0.9874999999999999 | 0 |
| 0.9881944444444444 | 0 |
| 0.9888888888888889 | 0 |
| 0.9895833333333334 | 0 |
| 0.9902777777777777 | 0 |
| 0.9909722222222223 | 0 |
| 0.9916666666666667 | 0 |
| 0.9923611111111111 | 0 |
| 0.9930555555555555 | 0 |
| 0.99375 | 0 |
| 0.9944444444444445 | 0 |
| 0.9951388888888889 | 0 |
| 0.9958333333333332 | 0 |
| 0.9965277777777778 | 0 |
| 0.9972222222222222 | 0 |
| 0.9979166666666667 | 0 |
| 0.998611111111111 | 0 |
| 0.9993055555555556 | 0 |